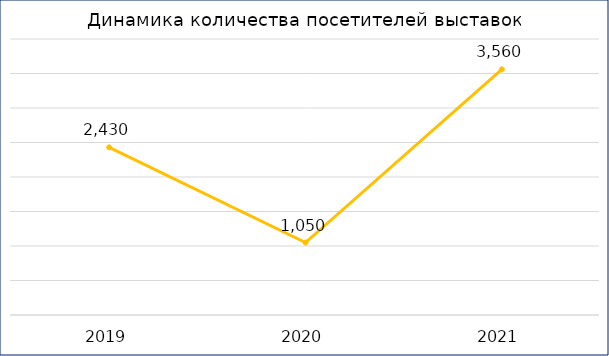
| Category | Кол-во посетителей |
|---|---|
| 2019.0 | 2430 |
| 2020.0 | 1050 |
| 2021.0 | 3560 |